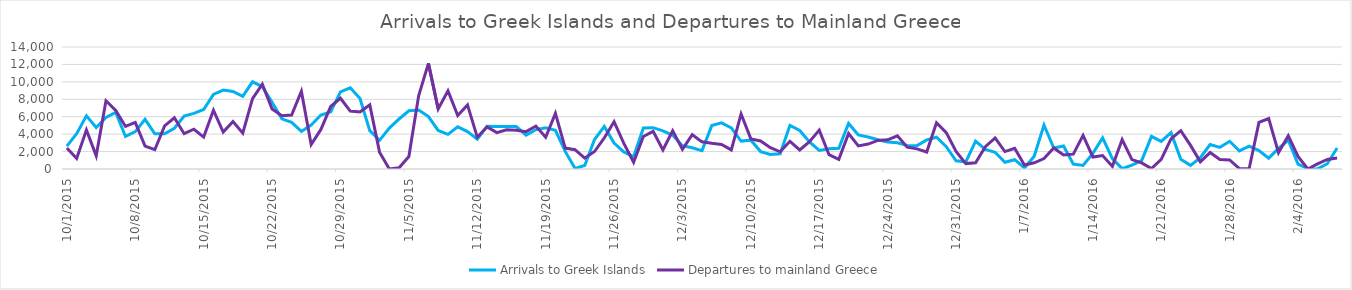
| Category | Arrivals to Greek Islands | Departures to mainland Greece |
|---|---|---|
| 10/1/15 | 2631 | 2409 |
| 10/2/15 | 4055 | 1215 |
| 10/3/15 | 6097 | 4480 |
| 10/4/15 | 4763 | 1513 |
| 10/5/15 | 5909 | 7833 |
| 10/6/15 | 6496 | 6707 |
| 10/7/15 | 3734 | 4886 |
| 10/8/15 | 4295 | 5349 |
| 10/9/15 | 5695 | 2631 |
| 10/10/15 | 4045 | 2214 |
| 10/11/15 | 4034 | 4950 |
| 10/12/15 | 4671 | 5879 |
| 10/13/15 | 6079 | 4052 |
| 10/14/15 | 6380 | 4564 |
| 10/15/15 | 6830 | 3660 |
| 10/16/15 | 8564 | 6743 |
| 10/17/15 | 9063 | 4239 |
| 10/18/15 | 8900 | 5457 |
| 10/19/15 | 8337 | 4119 |
| 10/20/15 | 10006 | 8083 |
| 10/21/15 | 9444 | 9725 |
| 10/22/15 | 7651 | 6896 |
| 10/23/15 | 5762 | 6120 |
| 10/24/15 | 5354 | 6195 |
| 10/25/15 | 4311 | 8916 |
| 10/26/15 | 5049 | 2804 |
| 10/27/15 | 6195 | 4540 |
| 10/28/15 | 6557 | 7191 |
| 10/29/15 | 8847 | 8117 |
| 10/30/15 | 9323 | 6649 |
| 10/31/15 | 8089 | 6537 |
| 11/1/15 | 4400 | 7360 |
| 11/2/15 | 3290 | 1935 |
| 11/3/15 | 4689 | 0 |
| 11/4/15 | 5740 | 142 |
| 11/5/15 | 6679 | 1430 |
| 11/6/15 | 6765 | 8392 |
| 11/7/15 | 6022 | 12116 |
| 11/8/15 | 4425 | 6902 |
| 11/9/15 | 3979 | 8977 |
| 11/10/15 | 4842 | 6133 |
| 11/11/15 | 4296 | 7354 |
| 11/12/15 | 3425 | 3650 |
| 11/13/15 | 4909 | 4820 |
| 11/14/15 | 4884 | 4171 |
| 11/15/15 | 4891 | 4497 |
| 11/16/15 | 4873 | 4442 |
| 11/17/15 | 3873 | 4289 |
| 11/18/15 | 4499 | 4927 |
| 11/19/15 | 4737 | 3644 |
| 11/20/15 | 4432 | 6389 |
| 11/21/15 | 2020 | 2401 |
| 11/22/15 | 76 | 2214 |
| 11/23/15 | 409 | 1245 |
| 11/24/15 | 3383 | 2006 |
| 11/25/15 | 4889 | 3565 |
| 11/26/15 | 2973 | 5435 |
| 11/27/15 | 1961 | 2932 |
| 11/28/15 | 1420 | 778 |
| 11/29/15 | 4703 | 3736 |
| 11/30/15 | 4744 | 4318 |
| 12/1/15 | 4386 | 2181 |
| 12/2/15 | 3863 | 4384 |
| 12/3/15 | 2671 | 2255 |
| 12/4/15 | 2435 | 3934 |
| 12/5/15 | 2110 | 3115 |
| 12/6/15 | 4978 | 2943 |
| 12/7/15 | 5287 | 2810 |
| 12/8/15 | 4721 | 2189 |
| 12/9/15 | 3203 | 6316 |
| 12/10/15 | 3308 | 3456 |
| 12/11/15 | 1999 | 3219 |
| 12/12/15 | 1671 | 2453 |
| 12/13/15 | 1738 | 1976 |
| 12/14/15 | 5005 | 3175 |
| 12/15/15 | 4421 | 2191 |
| 12/16/15 | 3105 | 3137 |
| 12/17/15 | 2135 | 4461 |
| 12/18/15 | 2330 | 1638 |
| 12/19/15 | 2373 | 1110 |
| 12/20/15 | 5223 | 4070 |
| 12/21/15 | 3904 | 2652 |
| 12/22/15 | 3668 | 2864 |
| 12/23/15 | 3354 | 3278 |
| 12/24/15 | 3110 | 3349 |
| 12/25/15 | 3008 | 3806 |
| 12/26/15 | 2710 | 2498 |
| 12/27/15 | 2678 | 2311 |
| 12/28/15 | 3337 | 1946 |
| 12/29/15 | 3643 | 5309 |
| 12/30/15 | 2552 | 4178 |
| 12/31/15 | 948 | 2009 |
| 1/1/16 | 828 | 623 |
| 1/2/16 | 3203 | 720 |
| 1/3/16 | 2241 | 2569 |
| 1/4/16 | 1917 | 3563 |
| 1/5/16 | 779 | 1998 |
| 1/6/16 | 1067 | 2377 |
| 1/7/16 | 119 | 463 |
| 1/8/16 | 1475 | 716 |
| 1/9/16 | 5050 | 1203 |
| 1/10/16 | 2410 | 2417 |
| 1/11/16 | 2645 | 1621 |
| 1/12/16 | 571 | 1701 |
| 1/13/16 | 408 | 3861 |
| 1/14/16 | 1792 | 1378 |
| 1/15/16 | 3564 | 1551 |
| 1/16/16 | 1188 | 301 |
| 1/17/16 | 39 | 3378 |
| 1/18/16 | 435 | 1078 |
| 1/19/16 | 964 | 695 |
| 1/20/16 | 3748 | 50 |
| 1/21/16 | 3166 | 1108 |
| 1/22/16 | 4176 | 3451 |
| 1/23/16 | 1124 | 4397 |
| 1/24/16 | 418 | 2706 |
| 1/25/16 | 1295 | 819 |
| 1/26/16 | 2808 | 1887 |
| 1/27/16 | 2488 | 1098 |
| 1/28/16 | 3180 | 1046 |
| 1/29/16 | 2076 | 40 |
| 1/30/16 | 2623 | 53 |
| 1/31/16 | 2105 | 5342 |
| 2/1/16 | 1244 | 5783 |
| 2/2/16 | 2368 | 1878 |
| 2/3/16 | 3299 | 3829 |
| 2/4/16 | 565 | 1436 |
| 2/5/16 | 38 | 0 |
| 2/6/16 | 7 | 578 |
| 2/7/16 | 608 | 1097 |
| 2/8/16 | 2418 | 1259 |